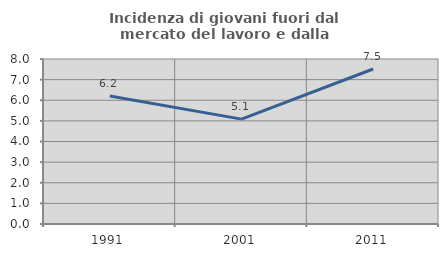
| Category | Incidenza di giovani fuori dal mercato del lavoro e dalla formazione  |
|---|---|
| 1991.0 | 6.211 |
| 2001.0 | 5.086 |
| 2011.0 | 7.516 |